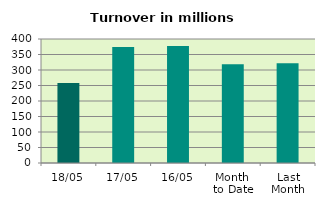
| Category | Series 0 |
|---|---|
| 18/05 | 257.848 |
| 17/05 | 374.393 |
| 16/05 | 377.214 |
| Month 
to Date | 318.352 |
| Last
Month | 322.024 |